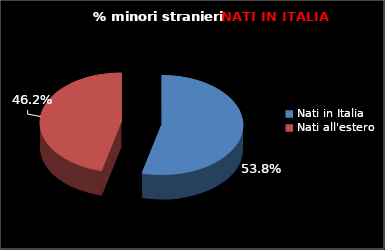
| Category | Series 0 |
|---|---|
| Nati in Italia | 77 |
| Nati all'estero | 66 |